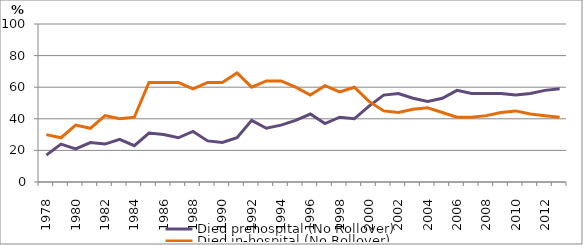
| Category | Died prehospital (No Rollover) | Died in-hospital (No Rollover) |
|---|---|---|
| 1978.0 | 17 | 30 |
| 1979.0 | 24 | 28 |
| 1980.0 | 21 | 36 |
| 1981.0 | 25 | 34 |
| 1982.0 | 24 | 42 |
| 1983.0 | 27 | 40 |
| 1984.0 | 23 | 41 |
| 1985.0 | 31 | 63 |
| 1986.0 | 30 | 63 |
| 1987.0 | 28 | 63 |
| 1988.0 | 32 | 59 |
| 1989.0 | 26 | 63 |
| 1990.0 | 25 | 63 |
| 1991.0 | 28 | 69 |
| 1992.0 | 39 | 60 |
| 1993.0 | 34 | 64 |
| 1994.0 | 36 | 64 |
| 1995.0 | 39 | 60 |
| 1996.0 | 43 | 55 |
| 1997.0 | 37 | 61 |
| 1998.0 | 41 | 57 |
| 1999.0 | 40 | 60 |
| 2000.0 | 48 | 51 |
| 2001.0 | 55 | 45 |
| 2002.0 | 56 | 44 |
| 2003.0 | 53 | 46 |
| 2004.0 | 51 | 47 |
| 2005.0 | 53 | 44 |
| 2006.0 | 58 | 41 |
| 2007.0 | 56 | 41 |
| 2008.0 | 56 | 42 |
| 2009.0 | 56 | 44 |
| 2010.0 | 55 | 45 |
| 2011.0 | 56 | 43 |
| 2012.0 | 58 | 42 |
| 2013.0 | 59 | 41 |